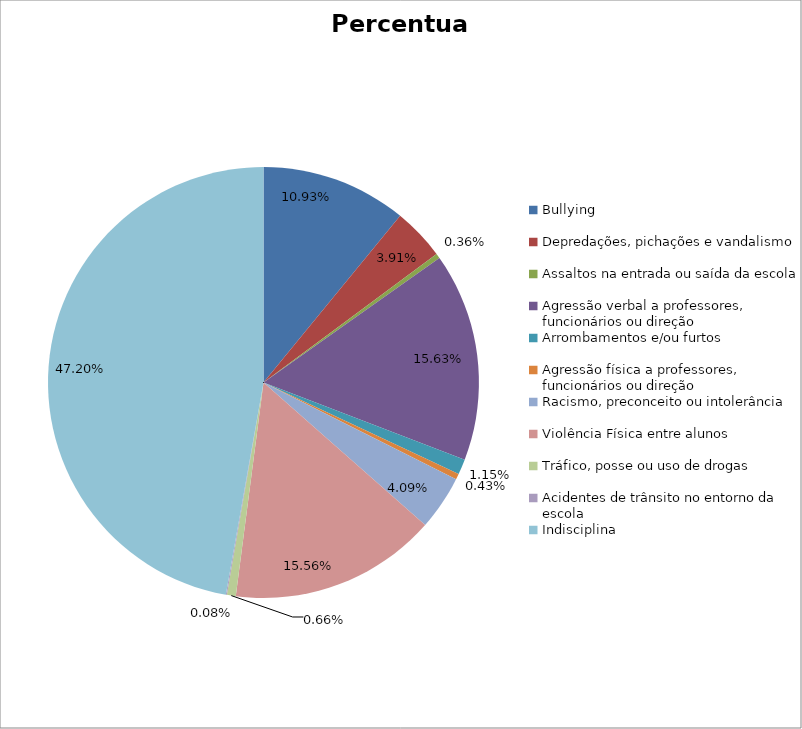
| Category | Percentual |
|---|---|
| Bullying | 0.109 |
| Depredações, pichações e vandalismo | 0.039 |
| Assaltos na entrada ou saída da escola | 0.004 |
| Agressão verbal a professores, funcionários ou direção | 0.156 |
| Arrombamentos e/ou furtos | 0.011 |
| Agressão física a professores, funcionários ou direção | 0.004 |
| Racismo, preconceito ou intolerância | 0.041 |
| Violência Física entre alunos | 0.156 |
| Tráfico, posse ou uso de drogas | 0.007 |
| Acidentes de trânsito no entorno da escola | 0.001 |
| Indisciplina | 0.472 |